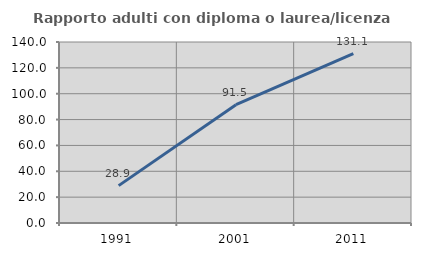
| Category | Rapporto adulti con diploma o laurea/licenza media  |
|---|---|
| 1991.0 | 28.906 |
| 2001.0 | 91.475 |
| 2011.0 | 131.083 |